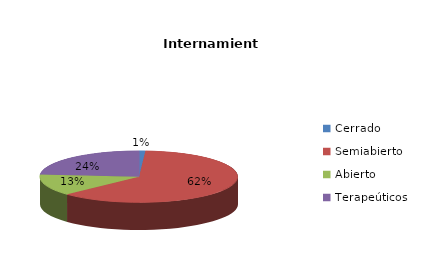
| Category | Series 0 |
|---|---|
| Cerrado | 1 |
| Semiabierto | 60 |
| Abierto | 13 |
| Terapeúticos | 23 |